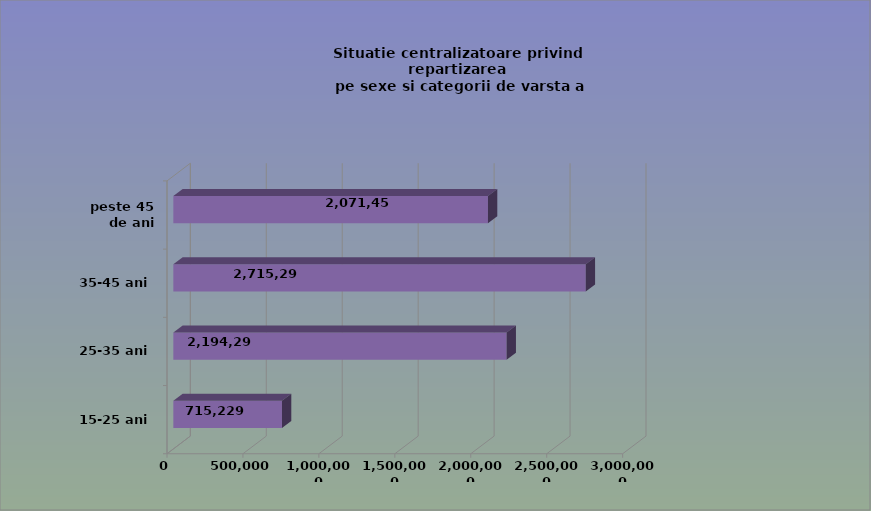
| Category | 15-25 ani 25-35 ani 35-45 ani peste 45 de ani |
|---|---|
| 15-25 ani | 715229 |
| 25-35 ani | 2194299 |
| 35-45 ani | 2715294 |
| peste 45 de ani | 2071454 |